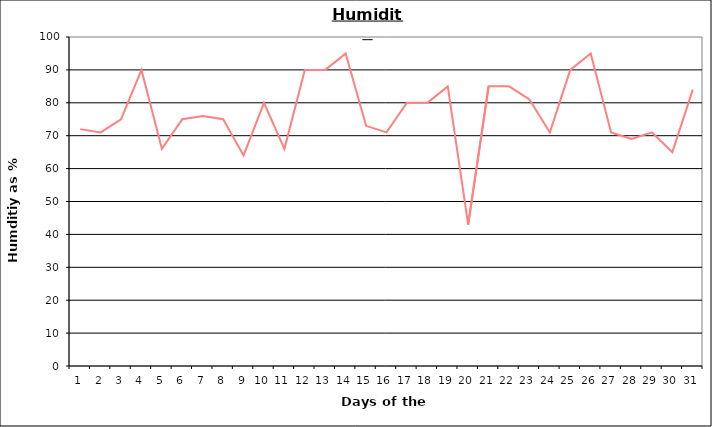
| Category | Series 0 |
|---|---|
| 0 | 72 |
| 1 | 71 |
| 2 | 75 |
| 3 | 90 |
| 4 | 66 |
| 5 | 75 |
| 6 | 76 |
| 7 | 75 |
| 8 | 64 |
| 9 | 80 |
| 10 | 66 |
| 11 | 90 |
| 12 | 90 |
| 13 | 95 |
| 14 | 73 |
| 15 | 71 |
| 16 | 80 |
| 17 | 80 |
| 18 | 85 |
| 19 | 43 |
| 20 | 85 |
| 21 | 85 |
| 22 | 81 |
| 23 | 71 |
| 24 | 90 |
| 25 | 95 |
| 26 | 71 |
| 27 | 69 |
| 28 | 71 |
| 29 | 65 |
| 30 | 84 |